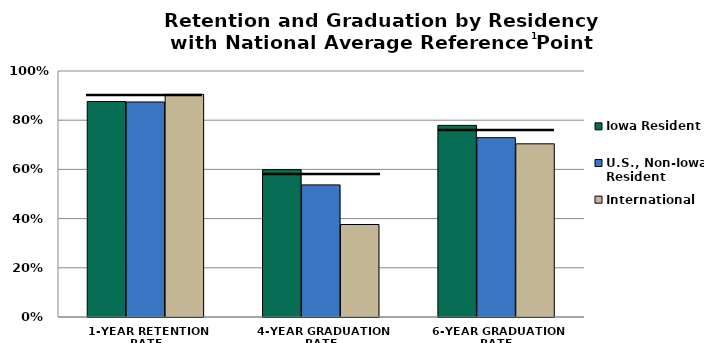
| Category | Iowa Resident | U.S., Non-Iowa Resident | International |
|---|---|---|---|
| 1-YEAR RETENTION RATE | 0.876 | 0.874 | 0.905 |
| 4-YEAR GRADUATION RATE | 0.599 | 0.537 | 0.376 |
| 6-YEAR GRADUATION RATE | 0.779 | 0.729 | 0.704 |